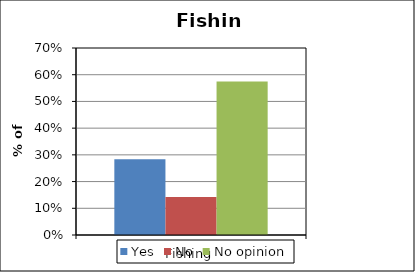
| Category | Yes | No | No opinion |
|---|---|---|---|
| Fishing | 0.284 | 0.142 | 0.574 |